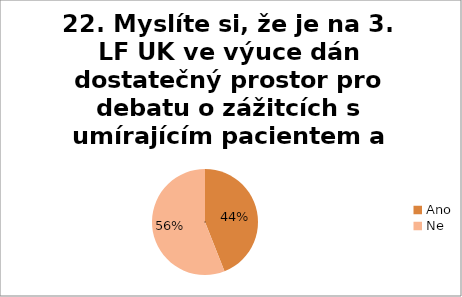
| Category | 22. Myslíte si, že je na 3. LF UK ve výuce dán dostatečný prostor pro debatu o zážitcích s umírajícím pacientem a se smrtí pacienta?  |
|---|---|
| Ano | 0.44 |
| Ne | 0.56 |